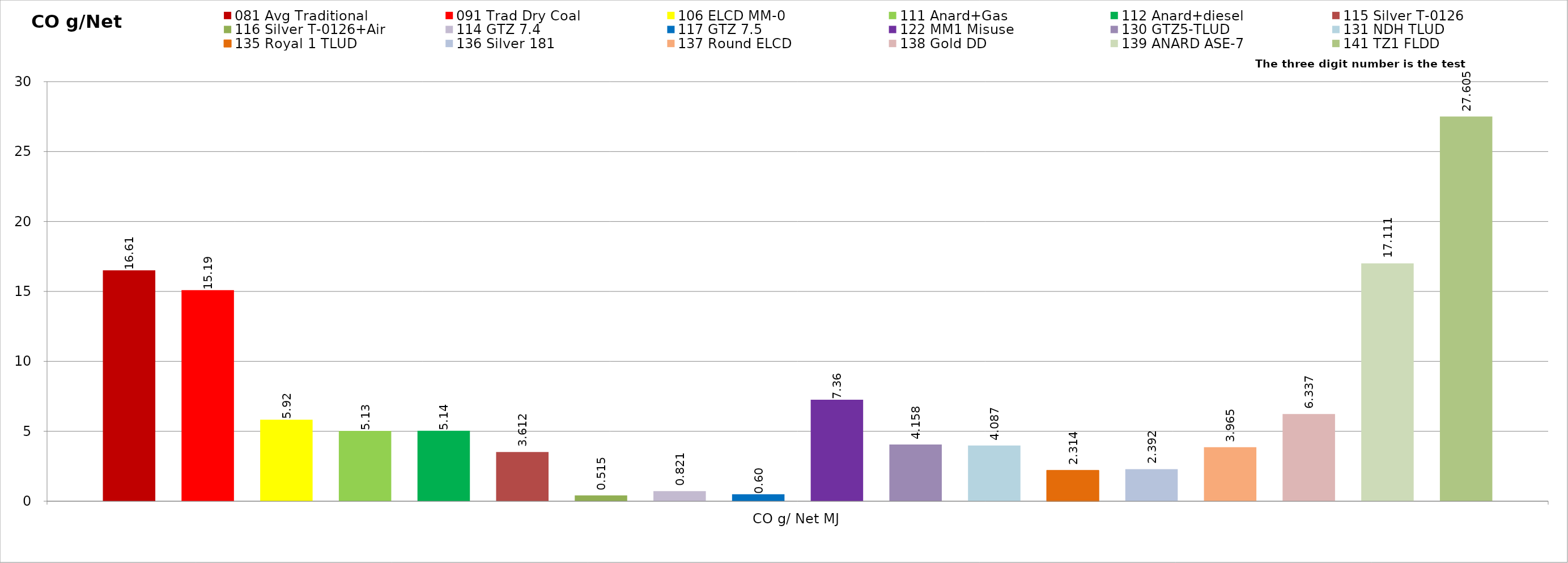
| Category | 081 Avg Traditional | 091 Trad Dry Coal | 106 ELCD MM-0 | 111 Anard+Gas | 112 Anard+diesel | 115 Silver T-0126 | 116 Silver T-0126+Air | 114 GTZ 7.4 | 117 GTZ 7.5 | 122 MM1 Misuse | 130 GTZ5-TLUD | 131 NDH TLUD | 135 Royal 1 TLUD | 136 Silver 181 | 137 Round ELCD | 138 Gold DD | 139 ANARD ASE-7 | 141 TZ1 FLDD |
|---|---|---|---|---|---|---|---|---|---|---|---|---|---|---|---|---|---|---|
| CO g/ Net MJ | 16.614 | 15.188 | 5.923 | 5.13 | 5.135 | 3.612 | 0.515 | 0.821 | 0.601 | 7.359 | 4.158 | 4.087 | 2.314 | 2.392 | 3.965 | 6.337 | 17.111 | 27.605 |